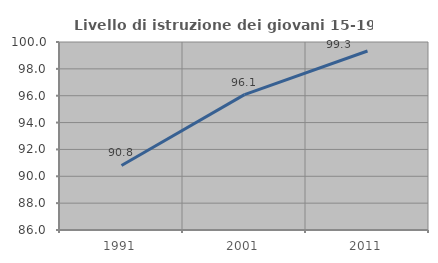
| Category | Livello di istruzione dei giovani 15-19 anni |
|---|---|
| 1991.0 | 90.805 |
| 2001.0 | 96.078 |
| 2011.0 | 99.329 |